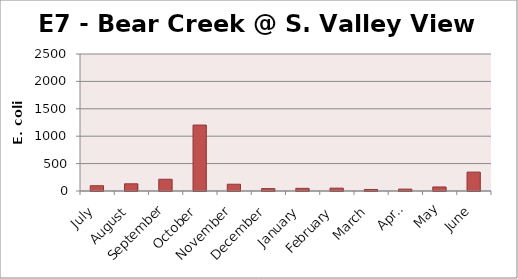
| Category | E. coli MPN |
|---|---|
| July | 95.9 |
| August | 131.4 |
| September | 214.3 |
| October | 1203.3 |
| November | 123.6 |
| December | 43.5 |
| January | 48 |
| February | 52 |
| March | 28.1 |
| April | 34.5 |
| May | 73.8 |
| June | 344.8 |